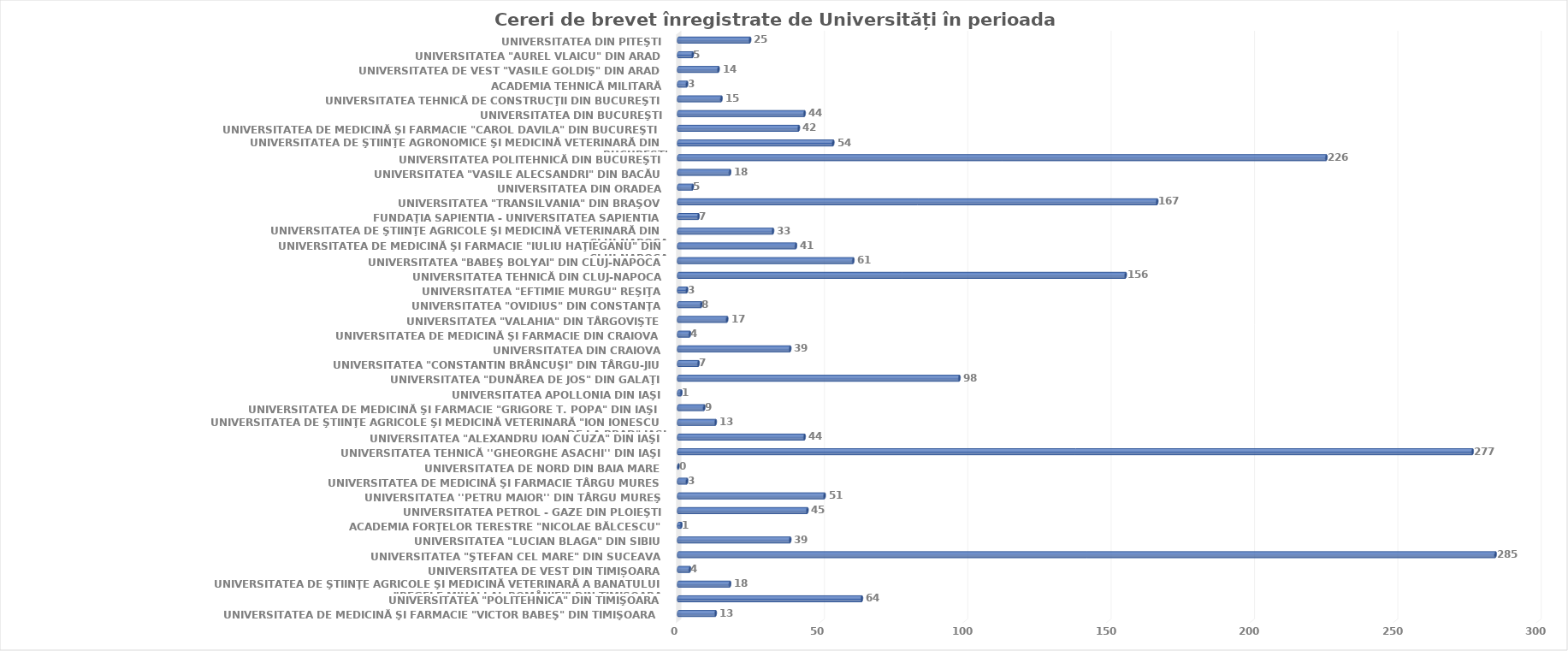
| Category | Series 0 |
|---|---|
| UNIVERSITATEA DE MEDICINĂ ŞI FARMACIE "VICTOR BABEŞ" DIN TIMIŞOARA | 13 |
| UNIVERSITATEA "POLITEHNICA" DIN TIMIŞOARA | 64 |
| UNIVERSITATEA DE ŞTIINŢE AGRICOLE ŞI MEDICINĂ VETERINARĂ A BANATULUI ”REGELE MIHAI I AL ROMÂNIEI” DIN TIMIŞOARA | 18 |
| UNIVERSITATEA DE VEST DIN TIMIȘOARA | 4 |
| UNIVERSITATEA "ŞTEFAN CEL MARE" DIN SUCEAVA | 285 |
| UNIVERSITATEA "LUCIAN BLAGA" DIN SIBIU | 39 |
| ACADEMIA FORŢELOR TERESTRE "NICOLAE BĂLCESCU" | 1 |
| UNIVERSITATEA PETROL - GAZE DIN PLOIEŞTI | 45 |
| UNIVERSITATEA ''PETRU MAIOR'' DIN TÂRGU MUREŞ | 51 |
| UNIVERSITATEA DE MEDICINĂ ŞI FARMACIE TÂRGU MURES | 3 |
| UNIVERSITATEA DE NORD DIN BAIA MARE | 0 |
| UNIVERSITATEA TEHNICĂ ''GHEORGHE ASACHI'' DIN IAŞI | 277 |
| UNIVERSITATEA "ALEXANDRU IOAN CUZA" DIN IAŞI | 44 |
| UNIVERSITATEA DE ŞTIINŢE AGRICOLE ŞI MEDICINĂ VETERINARĂ "ION IONESCU DE LA BRAD" IAŞI | 13 |
| UNIVERSITATEA DE MEDICINĂ ŞI FARMACIE "GRIGORE T. POPA" DIN IAŞI | 9 |
| UNIVERSITATEA APOLLONIA DIN IAŞI | 1 |
| UNIVERSITATEA "DUNĂREA DE JOS" DIN GALAŢI | 98 |
| UNIVERSITATEA "CONSTANTIN BRÂNCUŞI" DIN TÂRGU-JIU | 7 |
| UNIVERSITATEA DIN CRAIOVA | 39 |
| UNIVERSITATEA DE MEDICINĂ ŞI FARMACIE DIN CRAIOVA | 4 |
| UNIVERSITATEA "VALAHIA" DIN TÂRGOVIŞTE | 17 |
| UNIVERSITATEA "OVIDIUS" DIN CONSTANŢA | 8 |
| UNIVERSITATEA "EFTIMIE MURGU" REŞIŢA | 3 |
| UNIVERSITATEA TEHNICĂ DIN CLUJ-NAPOCA | 156 |
| UNIVERSITATEA "BABEŞ BOLYAI" DIN CLUJ-NAPOCA | 61 |
| UNIVERSITATEA DE MEDICINĂ ŞI FARMACIE "IULIU HAŢIEGANU" DIN CLUJ-NAPOCA | 41 |
| UNIVERSITATEA DE ŞTIINŢE AGRICOLE ŞI MEDICINĂ VETERINARĂ DIN CLUJ-NAPOCA | 33 |
| FUNDAŢIA SAPIENTIA - UNIVERSITATEA SAPIENTIA | 7 |
| UNIVERSITATEA "TRANSILVANIA" DIN BRAŞOV | 167 |
| UNIVERSITATEA DIN ORADEA | 5 |
| UNIVERSITATEA "VASILE ALECSANDRI" DIN BACĂU | 18 |
| UNIVERSITATEA POLITEHNICĂ DIN BUCUREŞTI | 226 |
| UNIVERSITATEA DE ŞTIINŢE AGRONOMICE ŞI MEDICINĂ VETERINARĂ DIN BUCUREŞTI | 54 |
| UNIVERSITATEA DE MEDICINĂ ŞI FARMACIE "CAROL DAVILA" DIN BUCUREŞTI | 42 |
| UNIVERSITATEA DIN BUCUREŞTI | 44 |
| UNIVERSITATEA TEHNICĂ DE CONSTRUCŢII DIN BUCUREŞTI | 15 |
| ACADEMIA TEHNICĂ MILITARĂ | 3 |
| UNIVERSITATEA DE VEST "VASILE GOLDIŞ" DIN ARAD | 14 |
| UNIVERSITATEA "AUREL VLAICU" DIN ARAD | 5 |
| UNIVERSITATEA DIN PITEŞTI | 25 |